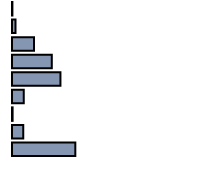
| Category | Series 0 |
|---|---|
| 0 | 0.2 |
| 1 | 1.8 |
| 2 | 10.9 |
| 3 | 19.8 |
| 4 | 24.1 |
| 5 | 5.8 |
| 6 | 0.3 |
| 7 | 5.6 |
| 8 | 31.5 |